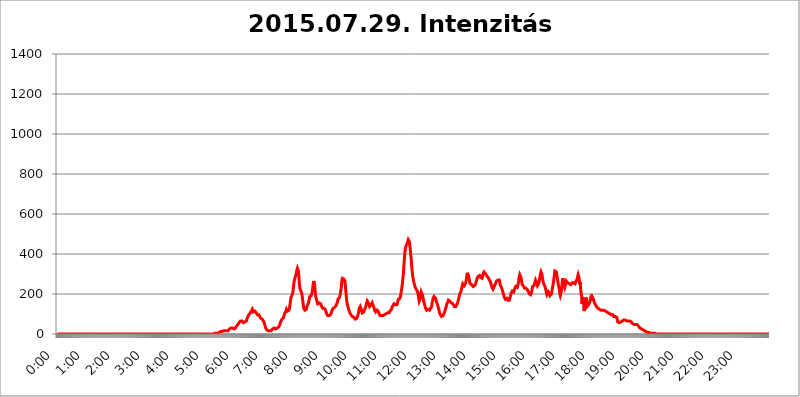
| Category | 2015.07.29. Intenzitás [W/m^2] |
|---|---|
| 0.0 | 0 |
| 0.0006944444444444445 | 0 |
| 0.001388888888888889 | 0 |
| 0.0020833333333333333 | 0 |
| 0.002777777777777778 | 0 |
| 0.003472222222222222 | 0 |
| 0.004166666666666667 | 0 |
| 0.004861111111111111 | 0 |
| 0.005555555555555556 | 0 |
| 0.0062499999999999995 | 0 |
| 0.006944444444444444 | 0 |
| 0.007638888888888889 | 0 |
| 0.008333333333333333 | 0 |
| 0.009027777777777779 | 0 |
| 0.009722222222222222 | 0 |
| 0.010416666666666666 | 0 |
| 0.011111111111111112 | 0 |
| 0.011805555555555555 | 0 |
| 0.012499999999999999 | 0 |
| 0.013194444444444444 | 0 |
| 0.013888888888888888 | 0 |
| 0.014583333333333332 | 0 |
| 0.015277777777777777 | 0 |
| 0.015972222222222224 | 0 |
| 0.016666666666666666 | 0 |
| 0.017361111111111112 | 0 |
| 0.018055555555555557 | 0 |
| 0.01875 | 0 |
| 0.019444444444444445 | 0 |
| 0.02013888888888889 | 0 |
| 0.020833333333333332 | 0 |
| 0.02152777777777778 | 0 |
| 0.022222222222222223 | 0 |
| 0.02291666666666667 | 0 |
| 0.02361111111111111 | 0 |
| 0.024305555555555556 | 0 |
| 0.024999999999999998 | 0 |
| 0.025694444444444447 | 0 |
| 0.02638888888888889 | 0 |
| 0.027083333333333334 | 0 |
| 0.027777777777777776 | 0 |
| 0.02847222222222222 | 0 |
| 0.029166666666666664 | 0 |
| 0.029861111111111113 | 0 |
| 0.030555555555555555 | 0 |
| 0.03125 | 0 |
| 0.03194444444444445 | 0 |
| 0.03263888888888889 | 0 |
| 0.03333333333333333 | 0 |
| 0.034027777777777775 | 0 |
| 0.034722222222222224 | 0 |
| 0.035416666666666666 | 0 |
| 0.036111111111111115 | 0 |
| 0.03680555555555556 | 0 |
| 0.0375 | 0 |
| 0.03819444444444444 | 0 |
| 0.03888888888888889 | 0 |
| 0.03958333333333333 | 0 |
| 0.04027777777777778 | 0 |
| 0.04097222222222222 | 0 |
| 0.041666666666666664 | 0 |
| 0.042361111111111106 | 0 |
| 0.04305555555555556 | 0 |
| 0.043750000000000004 | 0 |
| 0.044444444444444446 | 0 |
| 0.04513888888888889 | 0 |
| 0.04583333333333334 | 0 |
| 0.04652777777777778 | 0 |
| 0.04722222222222222 | 0 |
| 0.04791666666666666 | 0 |
| 0.04861111111111111 | 0 |
| 0.049305555555555554 | 0 |
| 0.049999999999999996 | 0 |
| 0.05069444444444445 | 0 |
| 0.051388888888888894 | 0 |
| 0.052083333333333336 | 0 |
| 0.05277777777777778 | 0 |
| 0.05347222222222222 | 0 |
| 0.05416666666666667 | 0 |
| 0.05486111111111111 | 0 |
| 0.05555555555555555 | 0 |
| 0.05625 | 0 |
| 0.05694444444444444 | 0 |
| 0.057638888888888885 | 0 |
| 0.05833333333333333 | 0 |
| 0.05902777777777778 | 0 |
| 0.059722222222222225 | 0 |
| 0.06041666666666667 | 0 |
| 0.061111111111111116 | 0 |
| 0.06180555555555556 | 0 |
| 0.0625 | 0 |
| 0.06319444444444444 | 0 |
| 0.06388888888888888 | 0 |
| 0.06458333333333334 | 0 |
| 0.06527777777777778 | 0 |
| 0.06597222222222222 | 0 |
| 0.06666666666666667 | 0 |
| 0.06736111111111111 | 0 |
| 0.06805555555555555 | 0 |
| 0.06874999999999999 | 0 |
| 0.06944444444444443 | 0 |
| 0.07013888888888889 | 0 |
| 0.07083333333333333 | 0 |
| 0.07152777777777779 | 0 |
| 0.07222222222222223 | 0 |
| 0.07291666666666667 | 0 |
| 0.07361111111111111 | 0 |
| 0.07430555555555556 | 0 |
| 0.075 | 0 |
| 0.07569444444444444 | 0 |
| 0.0763888888888889 | 0 |
| 0.07708333333333334 | 0 |
| 0.07777777777777778 | 0 |
| 0.07847222222222222 | 0 |
| 0.07916666666666666 | 0 |
| 0.0798611111111111 | 0 |
| 0.08055555555555556 | 0 |
| 0.08125 | 0 |
| 0.08194444444444444 | 0 |
| 0.08263888888888889 | 0 |
| 0.08333333333333333 | 0 |
| 0.08402777777777777 | 0 |
| 0.08472222222222221 | 0 |
| 0.08541666666666665 | 0 |
| 0.08611111111111112 | 0 |
| 0.08680555555555557 | 0 |
| 0.08750000000000001 | 0 |
| 0.08819444444444445 | 0 |
| 0.08888888888888889 | 0 |
| 0.08958333333333333 | 0 |
| 0.09027777777777778 | 0 |
| 0.09097222222222222 | 0 |
| 0.09166666666666667 | 0 |
| 0.09236111111111112 | 0 |
| 0.09305555555555556 | 0 |
| 0.09375 | 0 |
| 0.09444444444444444 | 0 |
| 0.09513888888888888 | 0 |
| 0.09583333333333333 | 0 |
| 0.09652777777777777 | 0 |
| 0.09722222222222222 | 0 |
| 0.09791666666666667 | 0 |
| 0.09861111111111111 | 0 |
| 0.09930555555555555 | 0 |
| 0.09999999999999999 | 0 |
| 0.10069444444444443 | 0 |
| 0.1013888888888889 | 0 |
| 0.10208333333333335 | 0 |
| 0.10277777777777779 | 0 |
| 0.10347222222222223 | 0 |
| 0.10416666666666667 | 0 |
| 0.10486111111111111 | 0 |
| 0.10555555555555556 | 0 |
| 0.10625 | 0 |
| 0.10694444444444444 | 0 |
| 0.1076388888888889 | 0 |
| 0.10833333333333334 | 0 |
| 0.10902777777777778 | 0 |
| 0.10972222222222222 | 0 |
| 0.1111111111111111 | 0 |
| 0.11180555555555556 | 0 |
| 0.11180555555555556 | 0 |
| 0.1125 | 0 |
| 0.11319444444444444 | 0 |
| 0.11388888888888889 | 0 |
| 0.11458333333333333 | 0 |
| 0.11527777777777777 | 0 |
| 0.11597222222222221 | 0 |
| 0.11666666666666665 | 0 |
| 0.1173611111111111 | 0 |
| 0.11805555555555557 | 0 |
| 0.11944444444444445 | 0 |
| 0.12013888888888889 | 0 |
| 0.12083333333333333 | 0 |
| 0.12152777777777778 | 0 |
| 0.12222222222222223 | 0 |
| 0.12291666666666667 | 0 |
| 0.12291666666666667 | 0 |
| 0.12361111111111112 | 0 |
| 0.12430555555555556 | 0 |
| 0.125 | 0 |
| 0.12569444444444444 | 0 |
| 0.12638888888888888 | 0 |
| 0.12708333333333333 | 0 |
| 0.16875 | 0 |
| 0.12847222222222224 | 0 |
| 0.12916666666666668 | 0 |
| 0.12986111111111112 | 0 |
| 0.13055555555555556 | 0 |
| 0.13125 | 0 |
| 0.13194444444444445 | 0 |
| 0.1326388888888889 | 0 |
| 0.13333333333333333 | 0 |
| 0.13402777777777777 | 0 |
| 0.13402777777777777 | 0 |
| 0.13472222222222222 | 0 |
| 0.13541666666666666 | 0 |
| 0.1361111111111111 | 0 |
| 0.13749999999999998 | 0 |
| 0.13819444444444443 | 0 |
| 0.1388888888888889 | 0 |
| 0.13958333333333334 | 0 |
| 0.14027777777777778 | 0 |
| 0.14097222222222222 | 0 |
| 0.14166666666666666 | 0 |
| 0.1423611111111111 | 0 |
| 0.14305555555555557 | 0 |
| 0.14375000000000002 | 0 |
| 0.14444444444444446 | 0 |
| 0.1451388888888889 | 0 |
| 0.1451388888888889 | 0 |
| 0.14652777777777778 | 0 |
| 0.14722222222222223 | 0 |
| 0.14791666666666667 | 0 |
| 0.1486111111111111 | 0 |
| 0.14930555555555555 | 0 |
| 0.15 | 0 |
| 0.15069444444444444 | 0 |
| 0.15138888888888888 | 0 |
| 0.15208333333333332 | 0 |
| 0.15277777777777776 | 0 |
| 0.15347222222222223 | 0 |
| 0.15416666666666667 | 0 |
| 0.15486111111111112 | 0 |
| 0.15555555555555556 | 0 |
| 0.15625 | 0 |
| 0.15694444444444444 | 0 |
| 0.15763888888888888 | 0 |
| 0.15833333333333333 | 0 |
| 0.15902777777777777 | 0 |
| 0.15972222222222224 | 0 |
| 0.16041666666666668 | 0 |
| 0.16111111111111112 | 0 |
| 0.16180555555555556 | 0 |
| 0.1625 | 0 |
| 0.16319444444444445 | 0 |
| 0.1638888888888889 | 0 |
| 0.16458333333333333 | 0 |
| 0.16527777777777777 | 0 |
| 0.16597222222222222 | 0 |
| 0.16666666666666666 | 0 |
| 0.1673611111111111 | 0 |
| 0.16805555555555554 | 0 |
| 0.16874999999999998 | 0 |
| 0.16944444444444443 | 0 |
| 0.17013888888888887 | 0 |
| 0.1708333333333333 | 0 |
| 0.17152777777777775 | 0 |
| 0.17222222222222225 | 0 |
| 0.1729166666666667 | 0 |
| 0.17361111111111113 | 0 |
| 0.17430555555555557 | 0 |
| 0.17500000000000002 | 0 |
| 0.17569444444444446 | 0 |
| 0.1763888888888889 | 0 |
| 0.17708333333333334 | 0 |
| 0.17777777777777778 | 0 |
| 0.17847222222222223 | 0 |
| 0.17916666666666667 | 0 |
| 0.1798611111111111 | 0 |
| 0.18055555555555555 | 0 |
| 0.18125 | 0 |
| 0.18194444444444444 | 0 |
| 0.1826388888888889 | 0 |
| 0.18333333333333335 | 0 |
| 0.1840277777777778 | 0 |
| 0.18472222222222223 | 0 |
| 0.18541666666666667 | 0 |
| 0.18611111111111112 | 0 |
| 0.18680555555555556 | 0 |
| 0.1875 | 0 |
| 0.18819444444444444 | 0 |
| 0.18888888888888888 | 0 |
| 0.18958333333333333 | 0 |
| 0.19027777777777777 | 0 |
| 0.1909722222222222 | 0 |
| 0.19166666666666665 | 0 |
| 0.19236111111111112 | 0 |
| 0.19305555555555554 | 0 |
| 0.19375 | 0 |
| 0.19444444444444445 | 0 |
| 0.1951388888888889 | 0 |
| 0.19583333333333333 | 0 |
| 0.19652777777777777 | 0 |
| 0.19722222222222222 | 0 |
| 0.19791666666666666 | 0 |
| 0.1986111111111111 | 0 |
| 0.19930555555555554 | 0 |
| 0.19999999999999998 | 0 |
| 0.20069444444444443 | 0 |
| 0.20138888888888887 | 0 |
| 0.2020833333333333 | 0 |
| 0.2027777777777778 | 0 |
| 0.2034722222222222 | 0 |
| 0.2041666666666667 | 0 |
| 0.20486111111111113 | 0 |
| 0.20555555555555557 | 0 |
| 0.20625000000000002 | 0 |
| 0.20694444444444446 | 0 |
| 0.2076388888888889 | 0 |
| 0.20833333333333334 | 0 |
| 0.20902777777777778 | 0 |
| 0.20972222222222223 | 0 |
| 0.21041666666666667 | 0 |
| 0.2111111111111111 | 0 |
| 0.21180555555555555 | 0 |
| 0.2125 | 0 |
| 0.21319444444444444 | 0 |
| 0.2138888888888889 | 0 |
| 0.21458333333333335 | 0 |
| 0.2152777777777778 | 0 |
| 0.21597222222222223 | 0 |
| 0.21666666666666667 | 0 |
| 0.21736111111111112 | 0 |
| 0.21805555555555556 | 0 |
| 0.21875 | 0 |
| 0.21944444444444444 | 3.525 |
| 0.22013888888888888 | 0 |
| 0.22083333333333333 | 3.525 |
| 0.22152777777777777 | 3.525 |
| 0.2222222222222222 | 3.525 |
| 0.22291666666666665 | 3.525 |
| 0.2236111111111111 | 7.887 |
| 0.22430555555555556 | 3.525 |
| 0.225 | 3.525 |
| 0.22569444444444445 | 7.887 |
| 0.2263888888888889 | 7.887 |
| 0.22708333333333333 | 7.887 |
| 0.22777777777777777 | 7.887 |
| 0.22847222222222222 | 12.257 |
| 0.22916666666666666 | 12.257 |
| 0.2298611111111111 | 12.257 |
| 0.23055555555555554 | 12.257 |
| 0.23124999999999998 | 12.257 |
| 0.23194444444444443 | 12.257 |
| 0.23263888888888887 | 12.257 |
| 0.2333333333333333 | 16.636 |
| 0.2340277777777778 | 16.636 |
| 0.2347222222222222 | 16.636 |
| 0.2354166666666667 | 16.636 |
| 0.23611111111111113 | 16.636 |
| 0.23680555555555557 | 16.636 |
| 0.23750000000000002 | 16.636 |
| 0.23819444444444446 | 12.257 |
| 0.2388888888888889 | 12.257 |
| 0.23958333333333334 | 16.636 |
| 0.24027777777777778 | 16.636 |
| 0.24097222222222223 | 21.024 |
| 0.24166666666666667 | 25.419 |
| 0.2423611111111111 | 25.419 |
| 0.24305555555555555 | 29.823 |
| 0.24375 | 29.823 |
| 0.24444444444444446 | 29.823 |
| 0.24513888888888888 | 29.823 |
| 0.24583333333333335 | 29.823 |
| 0.2465277777777778 | 25.419 |
| 0.24722222222222223 | 25.419 |
| 0.24791666666666667 | 25.419 |
| 0.24861111111111112 | 25.419 |
| 0.24930555555555556 | 29.823 |
| 0.25 | 29.823 |
| 0.25069444444444444 | 34.234 |
| 0.2513888888888889 | 38.653 |
| 0.2520833333333333 | 38.653 |
| 0.25277777777777777 | 43.079 |
| 0.2534722222222222 | 47.511 |
| 0.25416666666666665 | 47.511 |
| 0.2548611111111111 | 56.398 |
| 0.2555555555555556 | 56.398 |
| 0.25625000000000003 | 60.85 |
| 0.2569444444444445 | 65.31 |
| 0.2576388888888889 | 69.775 |
| 0.25833333333333336 | 69.775 |
| 0.2590277777777778 | 65.31 |
| 0.25972222222222224 | 65.31 |
| 0.2604166666666667 | 60.85 |
| 0.2611111111111111 | 56.398 |
| 0.26180555555555557 | 56.398 |
| 0.2625 | 56.398 |
| 0.26319444444444445 | 60.85 |
| 0.2638888888888889 | 60.85 |
| 0.26458333333333334 | 60.85 |
| 0.2652777777777778 | 65.31 |
| 0.2659722222222222 | 74.246 |
| 0.26666666666666666 | 78.722 |
| 0.2673611111111111 | 87.692 |
| 0.26805555555555555 | 92.184 |
| 0.26875 | 96.682 |
| 0.26944444444444443 | 101.184 |
| 0.2701388888888889 | 101.184 |
| 0.2708333333333333 | 105.69 |
| 0.27152777777777776 | 110.201 |
| 0.2722222222222222 | 114.716 |
| 0.27291666666666664 | 119.235 |
| 0.2736111111111111 | 123.758 |
| 0.2743055555555555 | 119.235 |
| 0.27499999999999997 | 110.201 |
| 0.27569444444444446 | 110.201 |
| 0.27638888888888885 | 110.201 |
| 0.27708333333333335 | 114.716 |
| 0.2777777777777778 | 114.716 |
| 0.27847222222222223 | 110.201 |
| 0.2791666666666667 | 105.69 |
| 0.2798611111111111 | 101.184 |
| 0.28055555555555556 | 96.682 |
| 0.28125 | 96.682 |
| 0.28194444444444444 | 96.682 |
| 0.2826388888888889 | 96.682 |
| 0.2833333333333333 | 92.184 |
| 0.28402777777777777 | 87.692 |
| 0.2847222222222222 | 83.205 |
| 0.28541666666666665 | 78.722 |
| 0.28611111111111115 | 74.246 |
| 0.28680555555555554 | 74.246 |
| 0.28750000000000003 | 74.246 |
| 0.2881944444444445 | 74.246 |
| 0.2888888888888889 | 65.31 |
| 0.28958333333333336 | 60.85 |
| 0.2902777777777778 | 56.398 |
| 0.29097222222222224 | 47.511 |
| 0.2916666666666667 | 38.653 |
| 0.2923611111111111 | 29.823 |
| 0.29305555555555557 | 25.419 |
| 0.29375 | 21.024 |
| 0.29444444444444445 | 21.024 |
| 0.2951388888888889 | 16.636 |
| 0.29583333333333334 | 16.636 |
| 0.2965277777777778 | 16.636 |
| 0.2972222222222222 | 16.636 |
| 0.29791666666666666 | 16.636 |
| 0.2986111111111111 | 16.636 |
| 0.29930555555555555 | 16.636 |
| 0.3 | 16.636 |
| 0.30069444444444443 | 21.024 |
| 0.3013888888888889 | 21.024 |
| 0.3020833333333333 | 25.419 |
| 0.30277777777777776 | 25.419 |
| 0.3034722222222222 | 29.823 |
| 0.30416666666666664 | 29.823 |
| 0.3048611111111111 | 29.823 |
| 0.3055555555555555 | 25.419 |
| 0.30624999999999997 | 25.419 |
| 0.3069444444444444 | 25.419 |
| 0.3076388888888889 | 25.419 |
| 0.30833333333333335 | 29.823 |
| 0.3090277777777778 | 29.823 |
| 0.30972222222222223 | 34.234 |
| 0.3104166666666667 | 34.234 |
| 0.3111111111111111 | 38.653 |
| 0.31180555555555556 | 43.079 |
| 0.3125 | 51.951 |
| 0.31319444444444444 | 56.398 |
| 0.3138888888888889 | 65.31 |
| 0.3145833333333333 | 65.31 |
| 0.31527777777777777 | 74.246 |
| 0.3159722222222222 | 74.246 |
| 0.31666666666666665 | 78.722 |
| 0.31736111111111115 | 83.205 |
| 0.31805555555555554 | 92.184 |
| 0.31875000000000003 | 101.184 |
| 0.3194444444444445 | 101.184 |
| 0.3201388888888889 | 105.69 |
| 0.32083333333333336 | 114.716 |
| 0.3215277777777778 | 123.758 |
| 0.32222222222222224 | 123.758 |
| 0.3229166666666667 | 114.716 |
| 0.3236111111111111 | 110.201 |
| 0.32430555555555557 | 110.201 |
| 0.325 | 119.235 |
| 0.32569444444444445 | 128.284 |
| 0.3263888888888889 | 146.423 |
| 0.32708333333333334 | 164.605 |
| 0.3277777777777778 | 182.82 |
| 0.3284722222222222 | 187.378 |
| 0.32916666666666666 | 191.937 |
| 0.3298611111111111 | 196.497 |
| 0.33055555555555555 | 210.182 |
| 0.33125 | 233 |
| 0.33194444444444443 | 255.813 |
| 0.3326388888888889 | 269.49 |
| 0.3333333333333333 | 278.603 |
| 0.3340277777777778 | 287.709 |
| 0.3347222222222222 | 296.808 |
| 0.3354166666666667 | 305.898 |
| 0.3361111111111111 | 319.517 |
| 0.3368055555555556 | 328.584 |
| 0.33749999999999997 | 328.584 |
| 0.33819444444444446 | 314.98 |
| 0.33888888888888885 | 287.709 |
| 0.33958333333333335 | 251.251 |
| 0.34027777777777773 | 228.436 |
| 0.34097222222222223 | 223.873 |
| 0.3416666666666666 | 214.746 |
| 0.3423611111111111 | 210.182 |
| 0.3430555555555555 | 201.058 |
| 0.34375 | 182.82 |
| 0.3444444444444445 | 164.605 |
| 0.3451388888888889 | 141.884 |
| 0.3458333333333334 | 128.284 |
| 0.34652777777777777 | 123.758 |
| 0.34722222222222227 | 119.235 |
| 0.34791666666666665 | 119.235 |
| 0.34861111111111115 | 119.235 |
| 0.34930555555555554 | 123.758 |
| 0.35000000000000003 | 137.347 |
| 0.3506944444444444 | 141.884 |
| 0.3513888888888889 | 146.423 |
| 0.3520833333333333 | 150.964 |
| 0.3527777777777778 | 160.056 |
| 0.3534722222222222 | 173.709 |
| 0.3541666666666667 | 187.378 |
| 0.3548611111111111 | 191.937 |
| 0.35555555555555557 | 191.937 |
| 0.35625 | 191.937 |
| 0.35694444444444445 | 201.058 |
| 0.3576388888888889 | 210.182 |
| 0.35833333333333334 | 228.436 |
| 0.3590277777777778 | 251.251 |
| 0.3597222222222222 | 264.932 |
| 0.36041666666666666 | 260.373 |
| 0.3611111111111111 | 242.127 |
| 0.36180555555555555 | 210.182 |
| 0.3625 | 187.378 |
| 0.36319444444444443 | 178.264 |
| 0.3638888888888889 | 169.156 |
| 0.3645833333333333 | 160.056 |
| 0.3652777777777778 | 150.964 |
| 0.3659722222222222 | 150.964 |
| 0.3666666666666667 | 150.964 |
| 0.3673611111111111 | 155.509 |
| 0.3680555555555556 | 155.509 |
| 0.36874999999999997 | 155.509 |
| 0.36944444444444446 | 150.964 |
| 0.37013888888888885 | 146.423 |
| 0.37083333333333335 | 137.347 |
| 0.37152777777777773 | 132.814 |
| 0.37222222222222223 | 128.284 |
| 0.3729166666666666 | 128.284 |
| 0.3736111111111111 | 128.284 |
| 0.3743055555555555 | 128.284 |
| 0.375 | 128.284 |
| 0.3756944444444445 | 123.758 |
| 0.3763888888888889 | 119.235 |
| 0.3770833333333334 | 110.201 |
| 0.37777777777777777 | 101.184 |
| 0.37847222222222227 | 96.682 |
| 0.37916666666666665 | 92.184 |
| 0.37986111111111115 | 92.184 |
| 0.38055555555555554 | 92.184 |
| 0.38125000000000003 | 92.184 |
| 0.3819444444444444 | 92.184 |
| 0.3826388888888889 | 92.184 |
| 0.3833333333333333 | 96.682 |
| 0.3840277777777778 | 101.184 |
| 0.3847222222222222 | 110.201 |
| 0.3854166666666667 | 119.235 |
| 0.3861111111111111 | 123.758 |
| 0.38680555555555557 | 128.284 |
| 0.3875 | 132.814 |
| 0.38819444444444445 | 132.814 |
| 0.3888888888888889 | 132.814 |
| 0.38958333333333334 | 132.814 |
| 0.3902777777777778 | 137.347 |
| 0.3909722222222222 | 141.884 |
| 0.39166666666666666 | 141.884 |
| 0.3923611111111111 | 146.423 |
| 0.39305555555555555 | 160.056 |
| 0.39375 | 173.709 |
| 0.39444444444444443 | 173.709 |
| 0.3951388888888889 | 178.264 |
| 0.3958333333333333 | 182.82 |
| 0.3965277777777778 | 191.937 |
| 0.3972222222222222 | 205.62 |
| 0.3979166666666667 | 219.309 |
| 0.3986111111111111 | 242.127 |
| 0.3993055555555556 | 269.49 |
| 0.39999999999999997 | 278.603 |
| 0.40069444444444446 | 278.603 |
| 0.40138888888888885 | 274.047 |
| 0.40208333333333335 | 274.047 |
| 0.40277777777777773 | 274.047 |
| 0.40347222222222223 | 264.932 |
| 0.4041666666666666 | 237.564 |
| 0.4048611111111111 | 210.182 |
| 0.4055555555555555 | 182.82 |
| 0.40625 | 160.056 |
| 0.4069444444444445 | 146.423 |
| 0.4076388888888889 | 137.347 |
| 0.4083333333333334 | 128.284 |
| 0.40902777777777777 | 119.235 |
| 0.40972222222222227 | 114.716 |
| 0.41041666666666665 | 105.69 |
| 0.41111111111111115 | 101.184 |
| 0.41180555555555554 | 96.682 |
| 0.41250000000000003 | 96.682 |
| 0.4131944444444444 | 92.184 |
| 0.4138888888888889 | 87.692 |
| 0.4145833333333333 | 87.692 |
| 0.4152777777777778 | 83.205 |
| 0.4159722222222222 | 83.205 |
| 0.4166666666666667 | 78.722 |
| 0.4173611111111111 | 78.722 |
| 0.41805555555555557 | 74.246 |
| 0.41875 | 74.246 |
| 0.41944444444444445 | 74.246 |
| 0.4201388888888889 | 78.722 |
| 0.42083333333333334 | 83.205 |
| 0.4215277777777778 | 92.184 |
| 0.4222222222222222 | 101.184 |
| 0.42291666666666666 | 114.716 |
| 0.4236111111111111 | 128.284 |
| 0.42430555555555555 | 132.814 |
| 0.425 | 137.347 |
| 0.42569444444444443 | 132.814 |
| 0.4263888888888889 | 123.758 |
| 0.4270833333333333 | 114.716 |
| 0.4277777777777778 | 105.69 |
| 0.4284722222222222 | 101.184 |
| 0.4291666666666667 | 105.69 |
| 0.4298611111111111 | 110.201 |
| 0.4305555555555556 | 114.716 |
| 0.43124999999999997 | 123.758 |
| 0.43194444444444446 | 128.284 |
| 0.43263888888888885 | 137.347 |
| 0.43333333333333335 | 146.423 |
| 0.43402777777777773 | 155.509 |
| 0.43472222222222223 | 164.605 |
| 0.4354166666666666 | 164.605 |
| 0.4361111111111111 | 160.056 |
| 0.4368055555555555 | 150.964 |
| 0.4375 | 146.423 |
| 0.4381944444444445 | 137.347 |
| 0.4388888888888889 | 137.347 |
| 0.4395833333333334 | 141.884 |
| 0.44027777777777777 | 146.423 |
| 0.44097222222222227 | 150.964 |
| 0.44166666666666665 | 155.509 |
| 0.44236111111111115 | 146.423 |
| 0.44305555555555554 | 141.884 |
| 0.44375000000000003 | 137.347 |
| 0.4444444444444444 | 128.284 |
| 0.4451388888888889 | 119.235 |
| 0.4458333333333333 | 114.716 |
| 0.4465277777777778 | 110.201 |
| 0.4472222222222222 | 110.201 |
| 0.4479166666666667 | 114.716 |
| 0.4486111111111111 | 119.235 |
| 0.44930555555555557 | 114.716 |
| 0.45 | 114.716 |
| 0.45069444444444445 | 110.201 |
| 0.4513888888888889 | 101.184 |
| 0.45208333333333334 | 96.682 |
| 0.4527777777777778 | 92.184 |
| 0.4534722222222222 | 92.184 |
| 0.45416666666666666 | 87.692 |
| 0.4548611111111111 | 92.184 |
| 0.45555555555555555 | 92.184 |
| 0.45625 | 92.184 |
| 0.45694444444444443 | 92.184 |
| 0.4576388888888889 | 92.184 |
| 0.4583333333333333 | 92.184 |
| 0.4590277777777778 | 96.682 |
| 0.4597222222222222 | 101.184 |
| 0.4604166666666667 | 101.184 |
| 0.4611111111111111 | 101.184 |
| 0.4618055555555556 | 101.184 |
| 0.46249999999999997 | 105.69 |
| 0.46319444444444446 | 105.69 |
| 0.46388888888888885 | 105.69 |
| 0.46458333333333335 | 105.69 |
| 0.46527777777777773 | 105.69 |
| 0.46597222222222223 | 110.201 |
| 0.4666666666666666 | 114.716 |
| 0.4673611111111111 | 114.716 |
| 0.4680555555555555 | 119.235 |
| 0.46875 | 123.758 |
| 0.4694444444444445 | 132.814 |
| 0.4701388888888889 | 137.347 |
| 0.4708333333333334 | 141.884 |
| 0.47152777777777777 | 146.423 |
| 0.47222222222222227 | 150.964 |
| 0.47291666666666665 | 150.964 |
| 0.47361111111111115 | 150.964 |
| 0.47430555555555554 | 146.423 |
| 0.47500000000000003 | 141.884 |
| 0.4756944444444444 | 141.884 |
| 0.4763888888888889 | 146.423 |
| 0.4770833333333333 | 150.964 |
| 0.4777777777777778 | 164.605 |
| 0.4784722222222222 | 173.709 |
| 0.4791666666666667 | 173.709 |
| 0.4798611111111111 | 173.709 |
| 0.48055555555555557 | 178.264 |
| 0.48125 | 187.378 |
| 0.48194444444444445 | 201.058 |
| 0.4826388888888889 | 214.746 |
| 0.48333333333333334 | 233 |
| 0.4840277777777778 | 251.251 |
| 0.4847222222222222 | 274.047 |
| 0.48541666666666666 | 301.354 |
| 0.4861111111111111 | 337.639 |
| 0.48680555555555555 | 373.729 |
| 0.4875 | 405.108 |
| 0.48819444444444443 | 427.39 |
| 0.4888888888888889 | 436.27 |
| 0.4895833333333333 | 445.129 |
| 0.4902777777777778 | 445.129 |
| 0.4909722222222222 | 453.968 |
| 0.4916666666666667 | 462.786 |
| 0.4923611111111111 | 471.582 |
| 0.4930555555555556 | 475.972 |
| 0.49374999999999997 | 462.786 |
| 0.49444444444444446 | 445.129 |
| 0.49513888888888885 | 422.943 |
| 0.49583333333333335 | 396.164 |
| 0.49652777777777773 | 369.23 |
| 0.49722222222222223 | 333.113 |
| 0.4979166666666666 | 310.44 |
| 0.4986111111111111 | 287.709 |
| 0.4993055555555555 | 274.047 |
| 0.5 | 260.373 |
| 0.5006944444444444 | 251.251 |
| 0.5013888888888889 | 242.127 |
| 0.5020833333333333 | 233 |
| 0.5027777777777778 | 228.436 |
| 0.5034722222222222 | 223.873 |
| 0.5041666666666667 | 219.309 |
| 0.5048611111111111 | 219.309 |
| 0.5055555555555555 | 210.182 |
| 0.50625 | 196.497 |
| 0.5069444444444444 | 178.264 |
| 0.5076388888888889 | 164.605 |
| 0.5083333333333333 | 164.605 |
| 0.5090277777777777 | 178.264 |
| 0.5097222222222222 | 196.497 |
| 0.5104166666666666 | 210.182 |
| 0.5111111111111112 | 210.182 |
| 0.5118055555555555 | 205.62 |
| 0.5125000000000001 | 191.937 |
| 0.5131944444444444 | 178.264 |
| 0.513888888888889 | 164.605 |
| 0.5145833333333333 | 155.509 |
| 0.5152777777777778 | 146.423 |
| 0.5159722222222222 | 137.347 |
| 0.5166666666666667 | 128.284 |
| 0.517361111111111 | 123.758 |
| 0.5180555555555556 | 119.235 |
| 0.5187499999999999 | 119.235 |
| 0.5194444444444445 | 119.235 |
| 0.5201388888888888 | 123.758 |
| 0.5208333333333334 | 119.235 |
| 0.5215277777777778 | 119.235 |
| 0.5222222222222223 | 119.235 |
| 0.5229166666666667 | 123.758 |
| 0.5236111111111111 | 128.284 |
| 0.5243055555555556 | 132.814 |
| 0.525 | 137.347 |
| 0.5256944444444445 | 150.964 |
| 0.5263888888888889 | 164.605 |
| 0.5270833333333333 | 178.264 |
| 0.5277777777777778 | 182.82 |
| 0.5284722222222222 | 187.378 |
| 0.5291666666666667 | 191.937 |
| 0.5298611111111111 | 187.378 |
| 0.5305555555555556 | 178.264 |
| 0.53125 | 169.156 |
| 0.5319444444444444 | 160.056 |
| 0.5326388888888889 | 155.509 |
| 0.5333333333333333 | 146.423 |
| 0.5340277777777778 | 137.347 |
| 0.5347222222222222 | 128.284 |
| 0.5354166666666667 | 119.235 |
| 0.5361111111111111 | 105.69 |
| 0.5368055555555555 | 101.184 |
| 0.5375 | 96.682 |
| 0.5381944444444444 | 92.184 |
| 0.5388888888888889 | 87.692 |
| 0.5395833333333333 | 92.184 |
| 0.5402777777777777 | 92.184 |
| 0.5409722222222222 | 92.184 |
| 0.5416666666666666 | 96.682 |
| 0.5423611111111112 | 101.184 |
| 0.5430555555555555 | 105.69 |
| 0.5437500000000001 | 114.716 |
| 0.5444444444444444 | 123.758 |
| 0.545138888888889 | 132.814 |
| 0.5458333333333333 | 141.884 |
| 0.5465277777777778 | 150.964 |
| 0.5472222222222222 | 155.509 |
| 0.5479166666666667 | 160.056 |
| 0.548611111111111 | 169.156 |
| 0.5493055555555556 | 169.156 |
| 0.5499999999999999 | 169.156 |
| 0.5506944444444445 | 164.605 |
| 0.5513888888888888 | 164.605 |
| 0.5520833333333334 | 160.056 |
| 0.5527777777777778 | 155.509 |
| 0.5534722222222223 | 155.509 |
| 0.5541666666666667 | 155.509 |
| 0.5548611111111111 | 150.964 |
| 0.5555555555555556 | 146.423 |
| 0.55625 | 146.423 |
| 0.5569444444444445 | 137.347 |
| 0.5576388888888889 | 132.814 |
| 0.5583333333333333 | 132.814 |
| 0.5590277777777778 | 137.347 |
| 0.5597222222222222 | 137.347 |
| 0.5604166666666667 | 146.423 |
| 0.5611111111111111 | 150.964 |
| 0.5618055555555556 | 160.056 |
| 0.5625 | 169.156 |
| 0.5631944444444444 | 178.264 |
| 0.5638888888888889 | 191.937 |
| 0.5645833333333333 | 201.058 |
| 0.5652777777777778 | 205.62 |
| 0.5659722222222222 | 210.182 |
| 0.5666666666666667 | 214.746 |
| 0.5673611111111111 | 228.436 |
| 0.5680555555555555 | 242.127 |
| 0.56875 | 251.251 |
| 0.5694444444444444 | 251.251 |
| 0.5701388888888889 | 246.689 |
| 0.5708333333333333 | 242.127 |
| 0.5715277777777777 | 246.689 |
| 0.5722222222222222 | 246.689 |
| 0.5729166666666666 | 255.813 |
| 0.5736111111111112 | 269.49 |
| 0.5743055555555555 | 287.709 |
| 0.5750000000000001 | 305.898 |
| 0.5756944444444444 | 305.898 |
| 0.576388888888889 | 301.354 |
| 0.5770833333333333 | 287.709 |
| 0.5777777777777778 | 274.047 |
| 0.5784722222222222 | 260.373 |
| 0.5791666666666667 | 251.251 |
| 0.579861111111111 | 246.689 |
| 0.5805555555555556 | 246.689 |
| 0.5812499999999999 | 246.689 |
| 0.5819444444444445 | 242.127 |
| 0.5826388888888888 | 242.127 |
| 0.5833333333333334 | 237.564 |
| 0.5840277777777778 | 237.564 |
| 0.5847222222222223 | 237.564 |
| 0.5854166666666667 | 242.127 |
| 0.5861111111111111 | 246.689 |
| 0.5868055555555556 | 251.251 |
| 0.5875 | 260.373 |
| 0.5881944444444445 | 269.49 |
| 0.5888888888888889 | 278.603 |
| 0.5895833333333333 | 283.156 |
| 0.5902777777777778 | 287.709 |
| 0.5909722222222222 | 292.259 |
| 0.5916666666666667 | 292.259 |
| 0.5923611111111111 | 292.259 |
| 0.5930555555555556 | 287.709 |
| 0.59375 | 283.156 |
| 0.5944444444444444 | 278.603 |
| 0.5951388888888889 | 278.603 |
| 0.5958333333333333 | 278.603 |
| 0.5965277777777778 | 287.709 |
| 0.5972222222222222 | 301.354 |
| 0.5979166666666667 | 305.898 |
| 0.5986111111111111 | 310.44 |
| 0.5993055555555555 | 310.44 |
| 0.6 | 305.898 |
| 0.6006944444444444 | 301.354 |
| 0.6013888888888889 | 296.808 |
| 0.6020833333333333 | 292.259 |
| 0.6027777777777777 | 287.709 |
| 0.6034722222222222 | 287.709 |
| 0.6041666666666666 | 283.156 |
| 0.6048611111111112 | 278.603 |
| 0.6055555555555555 | 274.047 |
| 0.6062500000000001 | 269.49 |
| 0.6069444444444444 | 264.932 |
| 0.607638888888889 | 260.373 |
| 0.6083333333333333 | 251.251 |
| 0.6090277777777778 | 242.127 |
| 0.6097222222222222 | 233 |
| 0.6104166666666667 | 228.436 |
| 0.611111111111111 | 223.873 |
| 0.6118055555555556 | 228.436 |
| 0.6124999999999999 | 233 |
| 0.6131944444444445 | 242.127 |
| 0.6138888888888888 | 242.127 |
| 0.6145833333333334 | 251.251 |
| 0.6152777777777778 | 255.813 |
| 0.6159722222222223 | 264.932 |
| 0.6166666666666667 | 269.49 |
| 0.6173611111111111 | 269.49 |
| 0.6180555555555556 | 269.49 |
| 0.61875 | 269.49 |
| 0.6194444444444445 | 274.047 |
| 0.6201388888888889 | 269.49 |
| 0.6208333333333333 | 255.813 |
| 0.6215277777777778 | 242.127 |
| 0.6222222222222222 | 237.564 |
| 0.6229166666666667 | 233 |
| 0.6236111111111111 | 228.436 |
| 0.6243055555555556 | 219.309 |
| 0.625 | 210.182 |
| 0.6256944444444444 | 201.058 |
| 0.6263888888888889 | 191.937 |
| 0.6270833333333333 | 182.82 |
| 0.6277777777777778 | 178.264 |
| 0.6284722222222222 | 173.709 |
| 0.6291666666666667 | 173.709 |
| 0.6298611111111111 | 173.709 |
| 0.6305555555555555 | 178.264 |
| 0.63125 | 173.709 |
| 0.6319444444444444 | 169.156 |
| 0.6326388888888889 | 164.605 |
| 0.6333333333333333 | 164.605 |
| 0.6340277777777777 | 169.156 |
| 0.6347222222222222 | 178.264 |
| 0.6354166666666666 | 187.378 |
| 0.6361111111111112 | 196.497 |
| 0.6368055555555555 | 205.62 |
| 0.6375000000000001 | 210.182 |
| 0.6381944444444444 | 214.746 |
| 0.638888888888889 | 210.182 |
| 0.6395833333333333 | 210.182 |
| 0.6402777777777778 | 210.182 |
| 0.6409722222222222 | 219.309 |
| 0.6416666666666667 | 228.436 |
| 0.642361111111111 | 233 |
| 0.6430555555555556 | 237.564 |
| 0.6437499999999999 | 237.564 |
| 0.6444444444444445 | 233 |
| 0.6451388888888888 | 233 |
| 0.6458333333333334 | 237.564 |
| 0.6465277777777778 | 251.251 |
| 0.6472222222222223 | 269.49 |
| 0.6479166666666667 | 287.709 |
| 0.6486111111111111 | 296.808 |
| 0.6493055555555556 | 301.354 |
| 0.65 | 292.259 |
| 0.6506944444444445 | 278.603 |
| 0.6513888888888889 | 260.373 |
| 0.6520833333333333 | 246.689 |
| 0.6527777777777778 | 242.127 |
| 0.6534722222222222 | 242.127 |
| 0.6541666666666667 | 237.564 |
| 0.6548611111111111 | 233 |
| 0.6555555555555556 | 228.436 |
| 0.65625 | 228.436 |
| 0.6569444444444444 | 228.436 |
| 0.6576388888888889 | 228.436 |
| 0.6583333333333333 | 228.436 |
| 0.6590277777777778 | 223.873 |
| 0.6597222222222222 | 219.309 |
| 0.6604166666666667 | 214.746 |
| 0.6611111111111111 | 210.182 |
| 0.6618055555555555 | 201.058 |
| 0.6625 | 201.058 |
| 0.6631944444444444 | 196.497 |
| 0.6638888888888889 | 196.497 |
| 0.6645833333333333 | 201.058 |
| 0.6652777777777777 | 210.182 |
| 0.6659722222222222 | 223.873 |
| 0.6666666666666666 | 237.564 |
| 0.6673611111111111 | 242.127 |
| 0.6680555555555556 | 242.127 |
| 0.6687500000000001 | 242.127 |
| 0.6694444444444444 | 246.689 |
| 0.6701388888888888 | 260.373 |
| 0.6708333333333334 | 269.49 |
| 0.6715277777777778 | 274.047 |
| 0.6722222222222222 | 264.932 |
| 0.6729166666666666 | 251.251 |
| 0.6736111111111112 | 242.127 |
| 0.6743055555555556 | 242.127 |
| 0.6749999999999999 | 246.689 |
| 0.6756944444444444 | 255.813 |
| 0.6763888888888889 | 274.047 |
| 0.6770833333333334 | 287.709 |
| 0.6777777777777777 | 301.354 |
| 0.6784722222222223 | 310.44 |
| 0.6791666666666667 | 310.44 |
| 0.6798611111111111 | 296.808 |
| 0.6805555555555555 | 278.603 |
| 0.68125 | 264.932 |
| 0.6819444444444445 | 255.813 |
| 0.6826388888888889 | 246.689 |
| 0.6833333333333332 | 242.127 |
| 0.6840277777777778 | 237.564 |
| 0.6847222222222222 | 228.436 |
| 0.6854166666666667 | 219.309 |
| 0.686111111111111 | 205.62 |
| 0.6868055555555556 | 196.497 |
| 0.6875 | 196.497 |
| 0.6881944444444444 | 201.058 |
| 0.688888888888889 | 210.182 |
| 0.6895833333333333 | 205.62 |
| 0.6902777777777778 | 201.058 |
| 0.6909722222222222 | 191.937 |
| 0.6916666666666668 | 191.937 |
| 0.6923611111111111 | 191.937 |
| 0.6930555555555555 | 201.058 |
| 0.69375 | 214.746 |
| 0.6944444444444445 | 228.436 |
| 0.6951388888888889 | 242.127 |
| 0.6958333333333333 | 255.813 |
| 0.6965277777777777 | 274.047 |
| 0.6972222222222223 | 296.808 |
| 0.6979166666666666 | 314.98 |
| 0.6986111111111111 | 319.517 |
| 0.6993055555555556 | 314.98 |
| 0.7000000000000001 | 310.44 |
| 0.7006944444444444 | 296.808 |
| 0.7013888888888888 | 278.603 |
| 0.7020833333333334 | 260.373 |
| 0.7027777777777778 | 246.689 |
| 0.7034722222222222 | 242.127 |
| 0.7041666666666666 | 223.873 |
| 0.7048611111111112 | 201.058 |
| 0.7055555555555556 | 191.937 |
| 0.7062499999999999 | 201.058 |
| 0.7069444444444444 | 214.746 |
| 0.7076388888888889 | 233 |
| 0.7083333333333334 | 260.373 |
| 0.7090277777777777 | 278.603 |
| 0.7097222222222223 | 274.047 |
| 0.7104166666666667 | 255.813 |
| 0.7111111111111111 | 242.127 |
| 0.7118055555555555 | 233 |
| 0.7125 | 242.127 |
| 0.7131944444444445 | 255.813 |
| 0.7138888888888889 | 264.932 |
| 0.7145833333333332 | 264.932 |
| 0.7152777777777778 | 260.373 |
| 0.7159722222222222 | 255.813 |
| 0.7166666666666667 | 255.813 |
| 0.717361111111111 | 251.251 |
| 0.7180555555555556 | 251.251 |
| 0.71875 | 246.689 |
| 0.7194444444444444 | 246.689 |
| 0.720138888888889 | 246.689 |
| 0.7208333333333333 | 251.251 |
| 0.7215277777777778 | 251.251 |
| 0.7222222222222222 | 255.813 |
| 0.7229166666666668 | 255.813 |
| 0.7236111111111111 | 255.813 |
| 0.7243055555555555 | 255.813 |
| 0.725 | 255.813 |
| 0.7256944444444445 | 251.251 |
| 0.7263888888888889 | 251.251 |
| 0.7270833333333333 | 255.813 |
| 0.7277777777777777 | 264.932 |
| 0.7284722222222223 | 269.49 |
| 0.7291666666666666 | 274.047 |
| 0.7298611111111111 | 287.709 |
| 0.7305555555555556 | 296.808 |
| 0.7312500000000001 | 296.808 |
| 0.7319444444444444 | 278.603 |
| 0.7326388888888888 | 251.251 |
| 0.7333333333333334 | 260.373 |
| 0.7340277777777778 | 228.436 |
| 0.7347222222222222 | 201.058 |
| 0.7354166666666666 | 191.937 |
| 0.7361111111111112 | 150.964 |
| 0.7368055555555556 | 182.82 |
| 0.7374999999999999 | 169.156 |
| 0.7381944444444444 | 155.509 |
| 0.7388888888888889 | 114.716 |
| 0.7395833333333334 | 119.235 |
| 0.7402777777777777 | 114.716 |
| 0.7409722222222223 | 164.605 |
| 0.7416666666666667 | 182.82 |
| 0.7423611111111111 | 150.964 |
| 0.7430555555555555 | 137.347 |
| 0.74375 | 132.814 |
| 0.7444444444444445 | 137.347 |
| 0.7451388888888889 | 146.423 |
| 0.7458333333333332 | 150.964 |
| 0.7465277777777778 | 155.509 |
| 0.7472222222222222 | 169.156 |
| 0.7479166666666667 | 178.264 |
| 0.748611111111111 | 173.709 |
| 0.7493055555555556 | 196.497 |
| 0.75 | 164.605 |
| 0.7506944444444444 | 182.82 |
| 0.751388888888889 | 182.82 |
| 0.7520833333333333 | 173.709 |
| 0.7527777777777778 | 164.605 |
| 0.7534722222222222 | 155.509 |
| 0.7541666666666668 | 150.964 |
| 0.7548611111111111 | 146.423 |
| 0.7555555555555555 | 141.884 |
| 0.75625 | 137.347 |
| 0.7569444444444445 | 132.814 |
| 0.7576388888888889 | 132.814 |
| 0.7583333333333333 | 128.284 |
| 0.7590277777777777 | 128.284 |
| 0.7597222222222223 | 128.284 |
| 0.7604166666666666 | 123.758 |
| 0.7611111111111111 | 123.758 |
| 0.7618055555555556 | 123.758 |
| 0.7625000000000001 | 119.235 |
| 0.7631944444444444 | 119.235 |
| 0.7638888888888888 | 119.235 |
| 0.7645833333333334 | 119.235 |
| 0.7652777777777778 | 119.235 |
| 0.7659722222222222 | 119.235 |
| 0.7666666666666666 | 119.235 |
| 0.7673611111111112 | 114.716 |
| 0.7680555555555556 | 114.716 |
| 0.7687499999999999 | 114.716 |
| 0.7694444444444444 | 110.201 |
| 0.7701388888888889 | 110.201 |
| 0.7708333333333334 | 110.201 |
| 0.7715277777777777 | 110.201 |
| 0.7722222222222223 | 105.69 |
| 0.7729166666666667 | 105.69 |
| 0.7736111111111111 | 105.69 |
| 0.7743055555555555 | 101.184 |
| 0.775 | 101.184 |
| 0.7756944444444445 | 101.184 |
| 0.7763888888888889 | 101.184 |
| 0.7770833333333332 | 96.682 |
| 0.7777777777777778 | 96.682 |
| 0.7784722222222222 | 96.682 |
| 0.7791666666666667 | 96.682 |
| 0.779861111111111 | 92.184 |
| 0.7805555555555556 | 87.692 |
| 0.78125 | 92.184 |
| 0.7819444444444444 | 92.184 |
| 0.782638888888889 | 87.692 |
| 0.7833333333333333 | 87.692 |
| 0.7840277777777778 | 87.692 |
| 0.7847222222222222 | 83.205 |
| 0.7854166666666668 | 83.205 |
| 0.7861111111111111 | 60.85 |
| 0.7868055555555555 | 56.398 |
| 0.7875 | 56.398 |
| 0.7881944444444445 | 56.398 |
| 0.7888888888888889 | 56.398 |
| 0.7895833333333333 | 56.398 |
| 0.7902777777777777 | 60.85 |
| 0.7909722222222223 | 60.85 |
| 0.7916666666666666 | 65.31 |
| 0.7923611111111111 | 65.31 |
| 0.7930555555555556 | 65.31 |
| 0.7937500000000001 | 69.775 |
| 0.7944444444444444 | 69.775 |
| 0.7951388888888888 | 74.246 |
| 0.7958333333333334 | 69.775 |
| 0.7965277777777778 | 69.775 |
| 0.7972222222222222 | 69.775 |
| 0.7979166666666666 | 69.775 |
| 0.7986111111111112 | 65.31 |
| 0.7993055555555556 | 65.31 |
| 0.7999999999999999 | 65.31 |
| 0.8006944444444444 | 65.31 |
| 0.8013888888888889 | 65.31 |
| 0.8020833333333334 | 65.31 |
| 0.8027777777777777 | 65.31 |
| 0.8034722222222223 | 65.31 |
| 0.8041666666666667 | 65.31 |
| 0.8048611111111111 | 60.85 |
| 0.8055555555555555 | 56.398 |
| 0.80625 | 56.398 |
| 0.8069444444444445 | 51.951 |
| 0.8076388888888889 | 47.511 |
| 0.8083333333333332 | 47.511 |
| 0.8090277777777778 | 47.511 |
| 0.8097222222222222 | 47.511 |
| 0.8104166666666667 | 47.511 |
| 0.811111111111111 | 47.511 |
| 0.8118055555555556 | 47.511 |
| 0.8125 | 47.511 |
| 0.8131944444444444 | 47.511 |
| 0.813888888888889 | 47.511 |
| 0.8145833333333333 | 43.079 |
| 0.8152777777777778 | 38.653 |
| 0.8159722222222222 | 38.653 |
| 0.8166666666666668 | 34.234 |
| 0.8173611111111111 | 29.823 |
| 0.8180555555555555 | 29.823 |
| 0.81875 | 25.419 |
| 0.8194444444444445 | 25.419 |
| 0.8201388888888889 | 21.024 |
| 0.8208333333333333 | 21.024 |
| 0.8215277777777777 | 21.024 |
| 0.8222222222222223 | 16.636 |
| 0.8229166666666666 | 16.636 |
| 0.8236111111111111 | 16.636 |
| 0.8243055555555556 | 12.257 |
| 0.8250000000000001 | 12.257 |
| 0.8256944444444444 | 12.257 |
| 0.8263888888888888 | 12.257 |
| 0.8270833333333334 | 12.257 |
| 0.8277777777777778 | 7.887 |
| 0.8284722222222222 | 7.887 |
| 0.8291666666666666 | 7.887 |
| 0.8298611111111112 | 7.887 |
| 0.8305555555555556 | 7.887 |
| 0.8312499999999999 | 7.887 |
| 0.8319444444444444 | 3.525 |
| 0.8326388888888889 | 3.525 |
| 0.8333333333333334 | 3.525 |
| 0.8340277777777777 | 3.525 |
| 0.8347222222222223 | 3.525 |
| 0.8354166666666667 | 3.525 |
| 0.8361111111111111 | 3.525 |
| 0.8368055555555555 | 3.525 |
| 0.8375 | 3.525 |
| 0.8381944444444445 | 3.525 |
| 0.8388888888888889 | 0 |
| 0.8395833333333332 | 0 |
| 0.8402777777777778 | 0 |
| 0.8409722222222222 | 0 |
| 0.8416666666666667 | 0 |
| 0.842361111111111 | 0 |
| 0.8430555555555556 | 0 |
| 0.84375 | 0 |
| 0.8444444444444444 | 0 |
| 0.845138888888889 | 0 |
| 0.8458333333333333 | 0 |
| 0.8465277777777778 | 0 |
| 0.8472222222222222 | 0 |
| 0.8479166666666668 | 0 |
| 0.8486111111111111 | 0 |
| 0.8493055555555555 | 0 |
| 0.85 | 0 |
| 0.8506944444444445 | 0 |
| 0.8513888888888889 | 0 |
| 0.8520833333333333 | 0 |
| 0.8527777777777777 | 0 |
| 0.8534722222222223 | 0 |
| 0.8541666666666666 | 0 |
| 0.8548611111111111 | 0 |
| 0.8555555555555556 | 0 |
| 0.8562500000000001 | 0 |
| 0.8569444444444444 | 0 |
| 0.8576388888888888 | 0 |
| 0.8583333333333334 | 0 |
| 0.8590277777777778 | 0 |
| 0.8597222222222222 | 0 |
| 0.8604166666666666 | 0 |
| 0.8611111111111112 | 0 |
| 0.8618055555555556 | 0 |
| 0.8624999999999999 | 0 |
| 0.8631944444444444 | 0 |
| 0.8638888888888889 | 0 |
| 0.8645833333333334 | 0 |
| 0.8652777777777777 | 0 |
| 0.8659722222222223 | 0 |
| 0.8666666666666667 | 0 |
| 0.8673611111111111 | 0 |
| 0.8680555555555555 | 0 |
| 0.86875 | 0 |
| 0.8694444444444445 | 0 |
| 0.8701388888888889 | 0 |
| 0.8708333333333332 | 0 |
| 0.8715277777777778 | 0 |
| 0.8722222222222222 | 0 |
| 0.8729166666666667 | 0 |
| 0.873611111111111 | 0 |
| 0.8743055555555556 | 0 |
| 0.875 | 0 |
| 0.8756944444444444 | 0 |
| 0.876388888888889 | 0 |
| 0.8770833333333333 | 0 |
| 0.8777777777777778 | 0 |
| 0.8784722222222222 | 0 |
| 0.8791666666666668 | 0 |
| 0.8798611111111111 | 0 |
| 0.8805555555555555 | 0 |
| 0.88125 | 0 |
| 0.8819444444444445 | 0 |
| 0.8826388888888889 | 0 |
| 0.8833333333333333 | 0 |
| 0.8840277777777777 | 0 |
| 0.8847222222222223 | 0 |
| 0.8854166666666666 | 0 |
| 0.8861111111111111 | 0 |
| 0.8868055555555556 | 0 |
| 0.8875000000000001 | 0 |
| 0.8881944444444444 | 0 |
| 0.8888888888888888 | 0 |
| 0.8895833333333334 | 0 |
| 0.8902777777777778 | 0 |
| 0.8909722222222222 | 0 |
| 0.8916666666666666 | 0 |
| 0.8923611111111112 | 0 |
| 0.8930555555555556 | 0 |
| 0.8937499999999999 | 0 |
| 0.8944444444444444 | 0 |
| 0.8951388888888889 | 0 |
| 0.8958333333333334 | 0 |
| 0.8965277777777777 | 0 |
| 0.8972222222222223 | 0 |
| 0.8979166666666667 | 0 |
| 0.8986111111111111 | 0 |
| 0.8993055555555555 | 0 |
| 0.9 | 0 |
| 0.9006944444444445 | 0 |
| 0.9013888888888889 | 0 |
| 0.9020833333333332 | 0 |
| 0.9027777777777778 | 0 |
| 0.9034722222222222 | 0 |
| 0.9041666666666667 | 0 |
| 0.904861111111111 | 0 |
| 0.9055555555555556 | 0 |
| 0.90625 | 0 |
| 0.9069444444444444 | 0 |
| 0.907638888888889 | 0 |
| 0.9083333333333333 | 0 |
| 0.9090277777777778 | 0 |
| 0.9097222222222222 | 0 |
| 0.9104166666666668 | 0 |
| 0.9111111111111111 | 0 |
| 0.9118055555555555 | 0 |
| 0.9125 | 0 |
| 0.9131944444444445 | 0 |
| 0.9138888888888889 | 0 |
| 0.9145833333333333 | 0 |
| 0.9152777777777777 | 0 |
| 0.9159722222222223 | 0 |
| 0.9166666666666666 | 0 |
| 0.9173611111111111 | 0 |
| 0.9180555555555556 | 0 |
| 0.9187500000000001 | 0 |
| 0.9194444444444444 | 0 |
| 0.9201388888888888 | 0 |
| 0.9208333333333334 | 0 |
| 0.9215277777777778 | 0 |
| 0.9222222222222222 | 0 |
| 0.9229166666666666 | 0 |
| 0.9236111111111112 | 0 |
| 0.9243055555555556 | 0 |
| 0.9249999999999999 | 0 |
| 0.9256944444444444 | 0 |
| 0.9263888888888889 | 0 |
| 0.9270833333333334 | 0 |
| 0.9277777777777777 | 0 |
| 0.9284722222222223 | 0 |
| 0.9291666666666667 | 0 |
| 0.9298611111111111 | 0 |
| 0.9305555555555555 | 0 |
| 0.93125 | 0 |
| 0.9319444444444445 | 0 |
| 0.9326388888888889 | 0 |
| 0.9333333333333332 | 0 |
| 0.9340277777777778 | 0 |
| 0.9347222222222222 | 0 |
| 0.9354166666666667 | 0 |
| 0.936111111111111 | 0 |
| 0.9368055555555556 | 0 |
| 0.9375 | 0 |
| 0.9381944444444444 | 0 |
| 0.938888888888889 | 0 |
| 0.9395833333333333 | 0 |
| 0.9402777777777778 | 0 |
| 0.9409722222222222 | 0 |
| 0.9416666666666668 | 0 |
| 0.9423611111111111 | 0 |
| 0.9430555555555555 | 0 |
| 0.94375 | 0 |
| 0.9444444444444445 | 0 |
| 0.9451388888888889 | 0 |
| 0.9458333333333333 | 0 |
| 0.9465277777777777 | 0 |
| 0.9472222222222223 | 0 |
| 0.9479166666666666 | 0 |
| 0.9486111111111111 | 0 |
| 0.9493055555555556 | 0 |
| 0.9500000000000001 | 0 |
| 0.9506944444444444 | 0 |
| 0.9513888888888888 | 0 |
| 0.9520833333333334 | 0 |
| 0.9527777777777778 | 0 |
| 0.9534722222222222 | 0 |
| 0.9541666666666666 | 0 |
| 0.9548611111111112 | 0 |
| 0.9555555555555556 | 0 |
| 0.9562499999999999 | 0 |
| 0.9569444444444444 | 0 |
| 0.9576388888888889 | 0 |
| 0.9583333333333334 | 0 |
| 0.9590277777777777 | 0 |
| 0.9597222222222223 | 0 |
| 0.9604166666666667 | 0 |
| 0.9611111111111111 | 0 |
| 0.9618055555555555 | 0 |
| 0.9625 | 0 |
| 0.9631944444444445 | 0 |
| 0.9638888888888889 | 0 |
| 0.9645833333333332 | 0 |
| 0.9652777777777778 | 0 |
| 0.9659722222222222 | 0 |
| 0.9666666666666667 | 0 |
| 0.967361111111111 | 0 |
| 0.9680555555555556 | 0 |
| 0.96875 | 0 |
| 0.9694444444444444 | 0 |
| 0.970138888888889 | 0 |
| 0.9708333333333333 | 0 |
| 0.9715277777777778 | 0 |
| 0.9722222222222222 | 0 |
| 0.9729166666666668 | 0 |
| 0.9736111111111111 | 0 |
| 0.9743055555555555 | 0 |
| 0.975 | 0 |
| 0.9756944444444445 | 0 |
| 0.9763888888888889 | 0 |
| 0.9770833333333333 | 0 |
| 0.9777777777777777 | 0 |
| 0.9784722222222223 | 0 |
| 0.9791666666666666 | 0 |
| 0.9798611111111111 | 0 |
| 0.9805555555555556 | 0 |
| 0.9812500000000001 | 0 |
| 0.9819444444444444 | 0 |
| 0.9826388888888888 | 0 |
| 0.9833333333333334 | 0 |
| 0.9840277777777778 | 0 |
| 0.9847222222222222 | 0 |
| 0.9854166666666666 | 0 |
| 0.9861111111111112 | 0 |
| 0.9868055555555556 | 0 |
| 0.9874999999999999 | 0 |
| 0.9881944444444444 | 0 |
| 0.9888888888888889 | 0 |
| 0.9895833333333334 | 0 |
| 0.9902777777777777 | 0 |
| 0.9909722222222223 | 0 |
| 0.9916666666666667 | 0 |
| 0.9923611111111111 | 0 |
| 0.9930555555555555 | 0 |
| 0.99375 | 0 |
| 0.9944444444444445 | 0 |
| 0.9951388888888889 | 0 |
| 0.9958333333333332 | 0 |
| 0.9965277777777778 | 0 |
| 0.9972222222222222 | 0 |
| 0.9979166666666667 | 0 |
| 0.998611111111111 | 0 |
| 0.9993055555555556 | 0 |